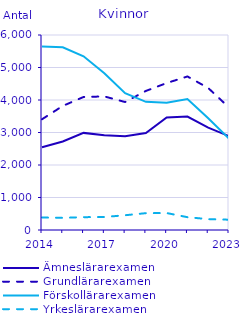
| Category | Ämneslärarexamen                                   | Grundlärarexamen                                   | Förskollärarexamen                                 | Yrkeslärarexamen                                   |
|---|---|---|---|---|
| 2014 | 2548 | 3407 | 5645 | 385 |
| 2015 | 2724 | 3818 | 5622 | 374 |
| 2016 | 2988 | 4093 | 5345 | 395 |
| 2017 | 2912 | 4110 | 4821 | 400 |
| 2018 | 2883 | 3938 | 4211 | 454 |
| 2019 | 2985 | 4279 | 3944 | 518 |
| 2020 | 3462 | 4522 | 3915 | 522 |
| 2021 | 3492 | 4724 | 4032 | 394 |
| 2022 | 3152 | 4369 | 3439 | 334 |
| 2023 | 2887 | 3769 | 2813 | 317 |